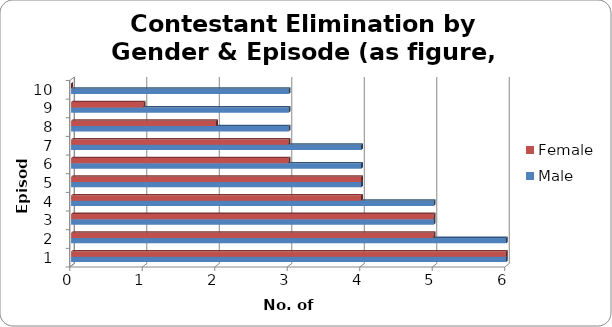
| Category | Male | Female |
|---|---|---|
| 0 | 6 | 6 |
| 1 | 6 | 5 |
| 2 | 5 | 5 |
| 3 | 5 | 4 |
| 4 | 4 | 4 |
| 5 | 4 | 3 |
| 6 | 4 | 3 |
| 7 | 3 | 2 |
| 8 | 3 | 1 |
| 9 | 3 | 0 |